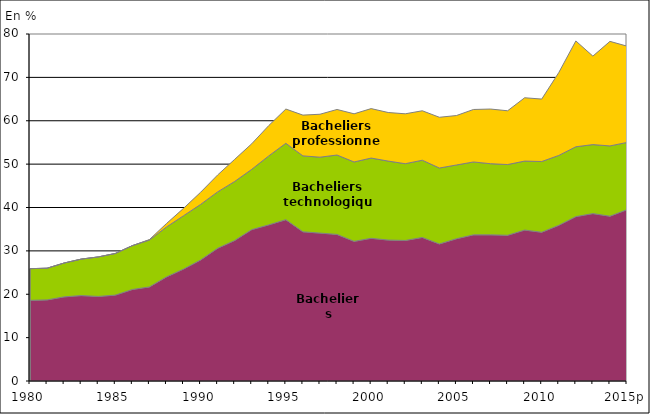
| Category | Bacheliers généraux | Bacheliers technologiques | Bacheliers professionnels |
|---|---|---|---|
| 1980 | 18.6 | 7.3 | 0 |
| 1981 | 18.7 | 7.3 | 0 |
| 1982 | 19.4 | 7.8 | 0 |
| 1983 | 19.7 | 8.4 | 0 |
| 1984 | 19.5 | 9.1 | 0 |
| 1985 | 19.8 | 9.6 | 0 |
| 1986 | 21.1 | 10.1 | 0 |
| 1987 | 21.7 | 10.8 | 0.1 |
| 1988 | 24 | 11.5 | 0.8 |
| 1989 | 25.8 | 12.3 | 1.7 |
| 1990 | 27.9 | 12.8 | 2.8 |
| 1991 | 30.6 | 13 | 3.9 |
| 1992 | 32.4 | 13.6 | 5.1 |
| 1993 | 34.9 | 13.9 | 5.9 |
| 1994 | 36 | 15.9 | 7 |
| 1995 | 37.2 | 17.6 | 7.9 |
| 1996 | 34.4 | 17.5 | 9.4 |
| 1997 | 34.1 | 17.5 | 9.9 |
| 1998 | 33.8 | 18.3 | 10.5 |
| 1999 | 32.2 | 18.3 | 11.1 |
| 2000 | 32.9 | 18.5 | 11.4 |
| 2001 | 32.5 | 18.2 | 11.2 |
| 2002 | 32.4 | 17.7 | 11.5 |
| 2003 | 33.1 | 17.8 | 11.4 |
| 2004 | 31.6 | 17.5 | 11.7 |
| 2005 | 32.8 | 17 | 11.4 |
| 2006 | 33.7 | 16.8 | 12.1 |
| 2007 | 33.7 | 16.4 | 12.6 |
| 2008 | 33.6 | 16.3 | 12.4 |
| 2009 | 34.8 | 15.9 | 14.6 |
| 2010 | 34.3 | 16.3 | 14.4 |
| 2011 | 35.9 | 16.1 | 19.1 |
| 2012 | 37.9 | 16.1 | 24.4 |
| 2013p | 38.6 | 15.9 | 20.4 |
| 2014p | 38 | 16.2 | 24.1 |
| 2015p | 39.5 | 15.5 | 22.2 |